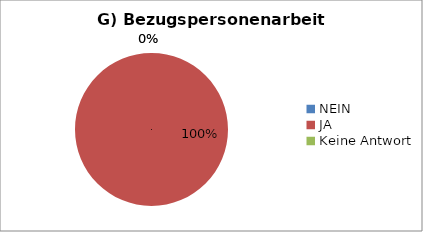
| Category | Series 0 |
|---|---|
| NEIN | 0 |
| JA | 52 |
| Keine Antwort | 0 |